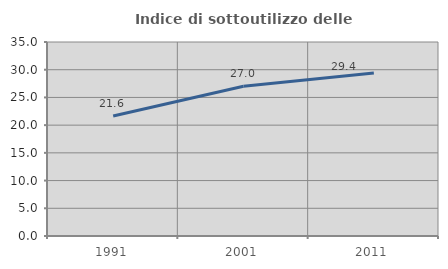
| Category | Indice di sottoutilizzo delle abitazioni  |
|---|---|
| 1991.0 | 21.649 |
| 2001.0 | 27.031 |
| 2011.0 | 29.398 |